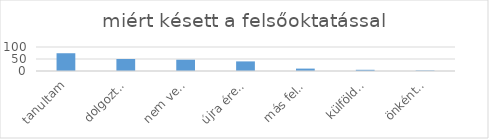
| Category | Series 0 |
|---|---|
| tanultam | 74 |
| dolgoztam | 50 |
| nem vettek fel elsőre | 47 |
| újra érettségitem (emelt szintű) | 40 |
| más felsőoktatási intézményből jöttem | 10 |
| külföldön voltam | 5 |
| önkénteskedtem | 2 |